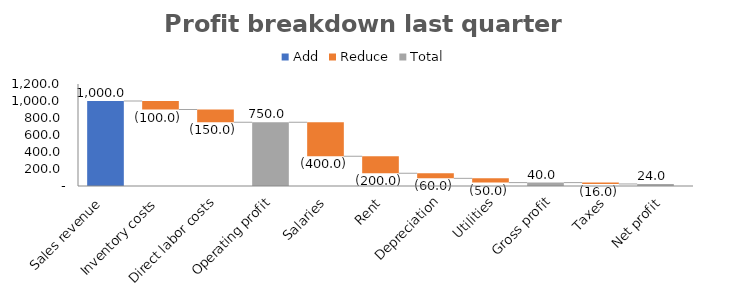
| Category | Series 0 |
|---|---|
| Net profit | 24 |
| Net profit last quarter | 12 |